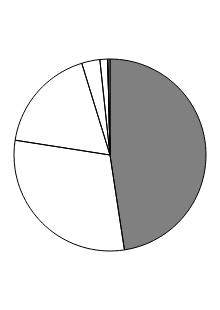
| Category | Series 0 |
|---|---|
| 0 | 47.596 |
| 1 | 29.867 |
| 2 | 17.786 |
| 3 | 3.059 |
| 4 | 1.318 |
| 5 | 0 |
| 6 | 0.373 |